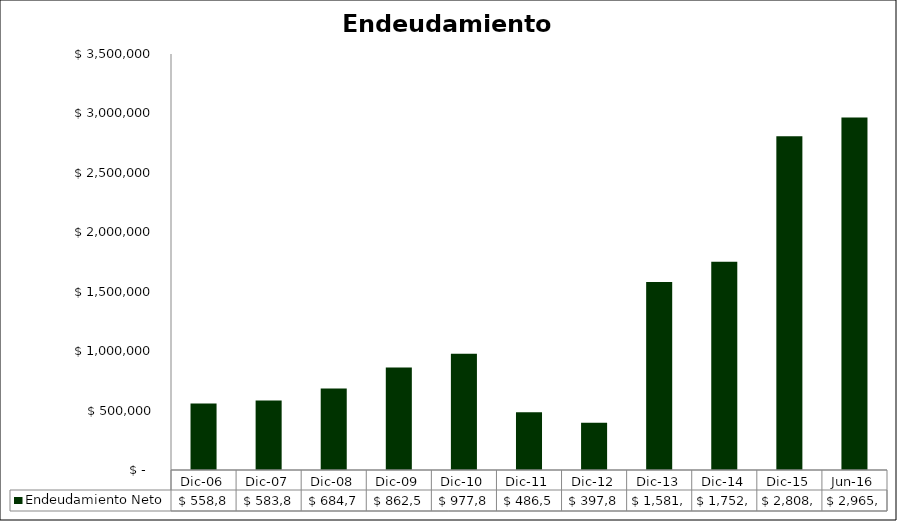
| Category | Endeudamiento Neto  |
|---|---|
| Dic-06 | 558856 |
| Dic-07 | 583844 |
| Dic-08 | 684783 |
| Dic-09 | 862585 |
| Dic-10 | 977827.862 |
| Dic-11 | 486511.217 |
| Dic-12 | 397862.444 |
| Dic-13 | 1581259.56 |
| Dic-14 | 1752414 |
| Dic-15 | 2808200.343 |
| Jun-16 | 2965569.286 |